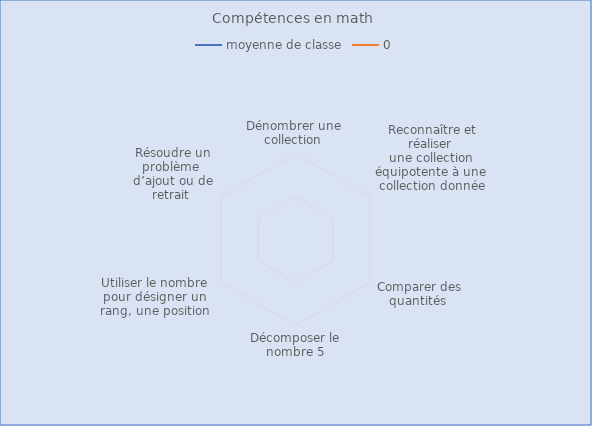
| Category | moyenne de classe | 0 |
|---|---|---|
| Dénombrer une 
collection  | 0 |  |
| Reconnaître et réaliser 
une collection 
équipotente à une 
collection donnée | 0 |  |
| Comparer des quantités  | 0 |  |
| Décomposer le nombre 5 | 0 |  |
| Utiliser le nombre 
pour désigner un 
rang, une position  | 0 |  |
| Résoudre un problème 
d’ajout ou de retrait  | 0 |  |